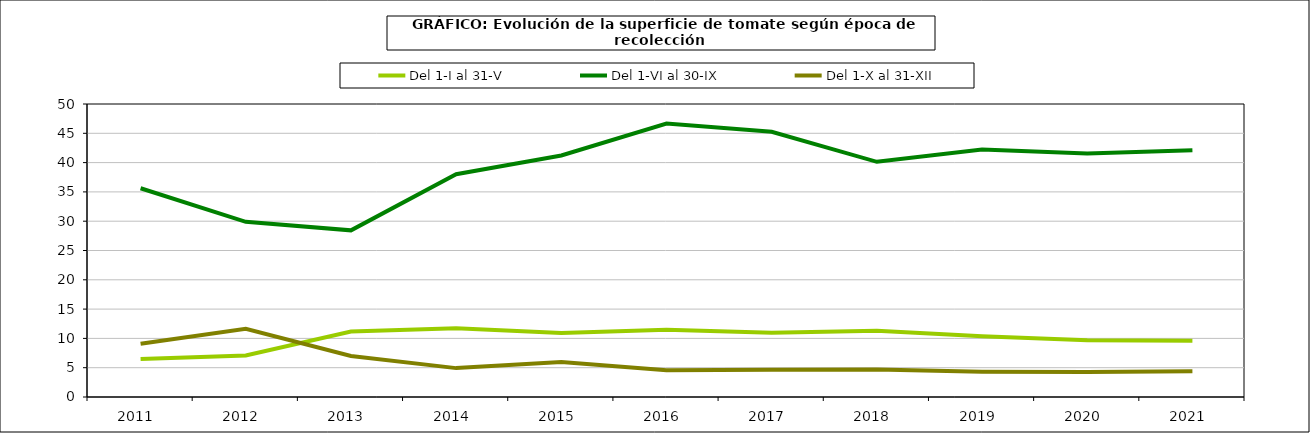
| Category | Del 1-I al 31-V | Del 1-VI al 30-IX | Del 1-X al 31-XII |
|---|---|---|---|
| 2011.0 | 6.491 | 35.62 | 9.093 |
| 2012.0 | 7.086 | 29.889 | 11.641 |
| 2013.0 | 11.18 | 28.439 | 7.005 |
| 2014.0 | 11.722 | 38.024 | 4.929 |
| 2015.0 | 10.934 | 41.208 | 5.992 |
| 2016.0 | 11.479 | 46.659 | 4.577 |
| 2017.0 | 10.948 | 45.266 | 4.638 |
| 2018.0 | 11.31 | 40.134 | 4.684 |
| 2019.0 | 10.386 | 42.229 | 4.322 |
| 2020.0 | 9.681 | 41.533 | 4.254 |
| 2021.0 | 9.595 | 42.098 | 4.413 |